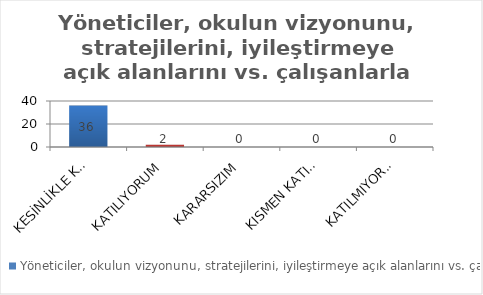
| Category | Yöneticiler, okulun vizyonunu, stratejilerini, iyileştirmeye açık alanlarını vs. çalışanlarla paylaşır. |
|---|---|
| KESİNLİKLE KATILIYORUM | 36 |
| KATILIYORUM | 2 |
| KARARSIZIM | 0 |
| KISMEN KATILIYORUM | 0 |
| KATILMIYORUM | 0 |